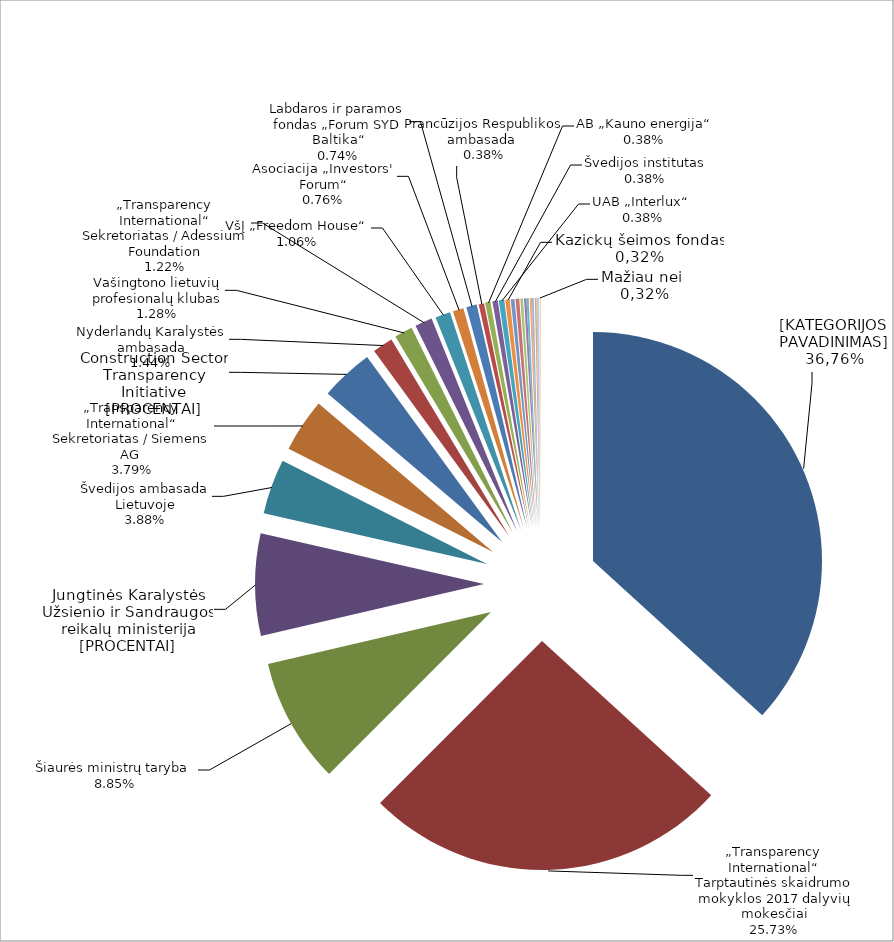
| Category | Series 0 | Series 1 |
|---|---|---|
| „Transparency International“ Sekretoriatas / Europos Komisija  | 97063.73 | 0.368 |
| „Transparency International“ Tarptautinės skaidrumo mokyklos 2017 dalyvių mokesčiai | 67939.23 | 0.257 |
| Šiaurės ministrų taryba  | 23375.04 | 0.089 |
| Jungtinės Karalystės Užsienio ir Sandraugos reikalų ministerija (UK Foreign and Commonwealth Office) | 19020.98 | 0.072 |
| Švedijos ambasada Lietuvoje | 10244.85 | 0.039 |
| „Transparency International“ Sekretoriatas / Siemens AG  | 10000 | 0.038 |
| Construction Sector Transparency Initiative (CoST) / Jungtinės Karalystės tarptautinio vystymo departamentas ir Nyderlandų Karalystės užsienio reikalų ministerija | 9901.93 | 0.037 |
| Nyderlandų Karalystės ambasada | 3800 | 0.014 |
| Vašingtono lietuvių profesionalų klubas | 3372.08 | 0.013 |
| „Transparency International“ Sekretoriatas / Adessium Foundation | 3231 | 0.012 |
| VšĮ „Freedom House“ | 2800 | 0.011 |
| Asociacija „Investors' Forum“ | 2000 | 0.008 |
| Labdaros ir paramos fondas „Forum SYD Baltika“ | 1950 | 0.007 |
| Prancūzijos Respublikos ambasada  | 1000 | 0.004 |
| AB „Kauno energija“ | 1000 | 0.004 |
| Švedijos institutas | 1000 | 0.004 |
| UAB „Interlux“  | 1000 | 0.004 |
| Kazickų šeimos fondas | 833.54 | 0.003 |
| Šiaurės ministrų tarybos biuras Lietuvoje | 700 | 0.003 |
| MB „Katsu“ | 700 | 0.003 |
| Milieu Ltd. / Europos Komisija | 500 | 0.002 |
| Kitos TILS uždirbtos lėšos | 456 | 0.002 |
| VšĮ „Pilietiškumo, demokratijos ir teisės programų centras“ | 419.3 | 0.002 |
| LR generalinė prokuratūra / LR finansų ministerija  | 400 | 0.002 |
| TILS skirtas gyventojų pajamų mokestis  | 351.66 | 0.001 |
| MB „Tai - tai“ | 300 | 0.001 |
| „Transparency International“ Latvijos skyrius | 200 | 0.001 |
| Lietuvos advokatūra | 150 | 0.001 |
| VšĮ „Europos Humanitarinis Universitetas“ | 150 | 0.001 |
| VšĮ „Rytų Europos studijų centras“ | 150 | 0.001 |